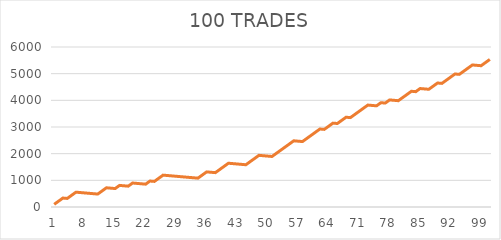
| Category | Series 0 |
|---|---|
| 0 | 100 |
| 1 | 217.56 |
| 2 | 335.12 |
| 3 | 320.96 |
| 4 | 438.52 |
| 5 | 556.08 |
| 6 | 541.92 |
| 7 | 527.76 |
| 8 | 513.6 |
| 9 | 499.44 |
| 10 | 485.28 |
| 11 | 602.84 |
| 12 | 720.4 |
| 13 | 706.24 |
| 14 | 692.08 |
| 15 | 809.64 |
| 16 | 795.48 |
| 17 | 781.32 |
| 18 | 898.88 |
| 19 | 884.72 |
| 20 | 870.56 |
| 21 | 856.4 |
| 22 | 973.96 |
| 23 | 959.8 |
| 24 | 1077.36 |
| 25 | 1194.92 |
| 26 | 1180.76 |
| 27 | 1166.6 |
| 28 | 1152.44 |
| 29 | 1138.28 |
| 30 | 1124.12 |
| 31 | 1109.96 |
| 32 | 1095.8 |
| 33 | 1081.64 |
| 34 | 1199.2 |
| 35 | 1316.76 |
| 36 | 1302.6 |
| 37 | 1288.44 |
| 38 | 1406 |
| 39 | 1523.56 |
| 40 | 1641.12 |
| 41 | 1626.96 |
| 42 | 1612.8 |
| 43 | 1598.64 |
| 44 | 1584.48 |
| 45 | 1702.04 |
| 46 | 1819.6 |
| 47 | 1937.16 |
| 48 | 1923 |
| 49 | 1908.84 |
| 50 | 1894.68 |
| 51 | 2012.24 |
| 52 | 2129.8 |
| 53 | 2247.36 |
| 54 | 2364.92 |
| 55 | 2482.48 |
| 56 | 2468.32 |
| 57 | 2454.16 |
| 58 | 2571.72 |
| 59 | 2689.28 |
| 60 | 2806.84 |
| 61 | 2924.4 |
| 62 | 2910.24 |
| 63 | 3027.8 |
| 64 | 3145.36 |
| 65 | 3131.2 |
| 66 | 3248.76 |
| 67 | 3366.32 |
| 68 | 3352.16 |
| 69 | 3469.72 |
| 70 | 3587.28 |
| 71 | 3704.84 |
| 72 | 3822.4 |
| 73 | 3808.24 |
| 74 | 3794.08 |
| 75 | 3911.64 |
| 76 | 3897.48 |
| 77 | 4015.04 |
| 78 | 4000.88 |
| 79 | 3986.72 |
| 80 | 4104.28 |
| 81 | 4221.84 |
| 82 | 4339.4 |
| 83 | 4325.24 |
| 84 | 4442.8 |
| 85 | 4428.64 |
| 86 | 4414.48 |
| 87 | 4532.04 |
| 88 | 4649.6 |
| 89 | 4635.44 |
| 90 | 4753 |
| 91 | 4870.56 |
| 92 | 4988.12 |
| 93 | 4973.96 |
| 94 | 5091.52 |
| 95 | 5209.08 |
| 96 | 5326.64 |
| 97 | 5312.48 |
| 98 | 5298.32 |
| 99 | 5415.88 |
| 100 | 5533.44 |